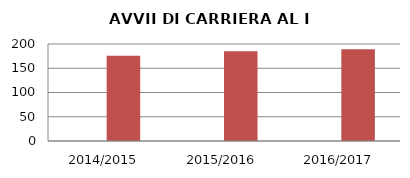
| Category | ANNO | NUMERO |
|---|---|---|
| 2014/2015 | 0 | 176 |
| 2015/2016 | 0 | 185 |
| 2016/2017 | 0 | 189 |